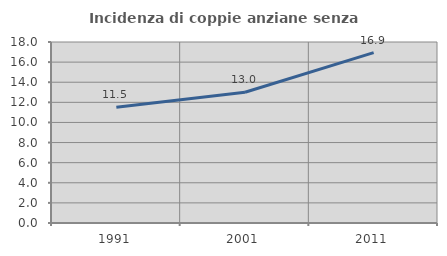
| Category | Incidenza di coppie anziane senza figli  |
|---|---|
| 1991.0 | 11.509 |
| 2001.0 | 13.002 |
| 2011.0 | 16.949 |